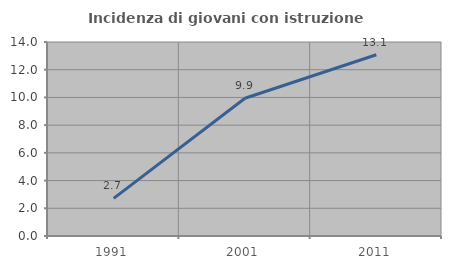
| Category | Incidenza di giovani con istruzione universitaria |
|---|---|
| 1991.0 | 2.717 |
| 2001.0 | 9.939 |
| 2011.0 | 13.08 |